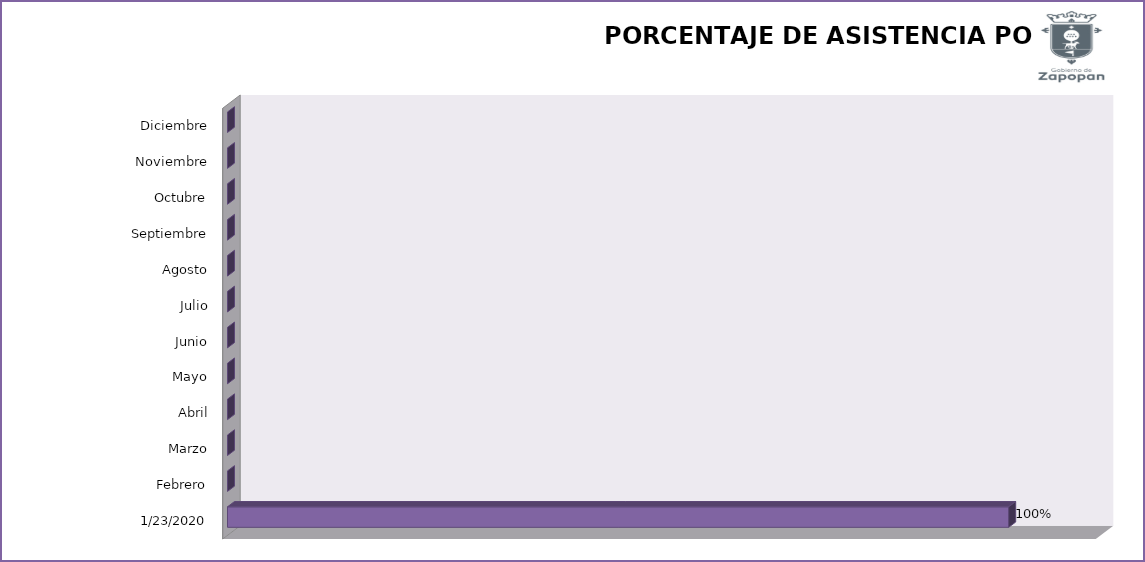
| Category | Series 0 |
|---|---|
| 23/01/2020 | 94.737 |
| Febrero | 0 |
| Marzo | 0 |
| Abril | 0 |
| Mayo | 0 |
| Junio | 0 |
| Julio | 0 |
| Agosto | 0 |
| Septiembre | 0 |
| Octubre | 0 |
| Noviembre | 0 |
| Diciembre | 0 |